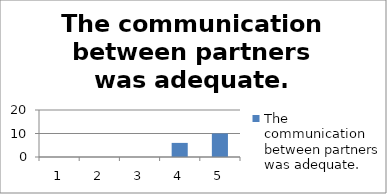
| Category | The communication between partners was adequate. |
|---|---|
| 0 | 0 |
| 1 | 0 |
| 2 | 0 |
| 3 | 6 |
| 4 | 10 |